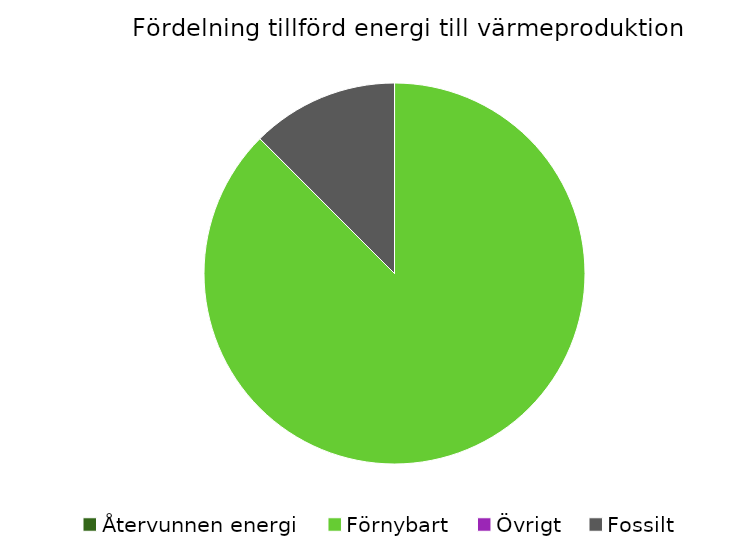
| Category | Fördelning värmeproduktion |
|---|---|
| Återvunnen energi | 0 |
| Förnybart | 0.875 |
| Övrigt | 0 |
| Fossilt | 0.125 |